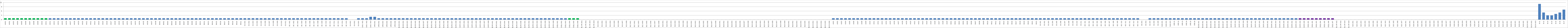
| Category | Series 0 |
|---|---|
| AW01 | 1 |
| AW02 | 1 |
| AW03 | 1 |
| AW04 | 1 |
| AW05 | 1 |
| AW06 | 1 |
| AW07 | 1 |
| AW08 | 1 |
| AW09 | 1 |
| AW10 | 1 |
| AW11 | 1 |
| AW12 | 1 |
| AW13 | 1 |
| AW14 | 1 |
| AW15 | 1 |
| AW16 | 1 |
| AW17 | 1 |
| AW18 | 1 |
| AW19 | 1 |
| AW20 | 1 |
| AW21 | 1 |
| AW22 | 1 |
| AW23 | 1 |
| AW24 | 1 |
| AW25 | 1 |
| AW26 | 1 |
| AW27 | 1 |
| AW28 | 1 |
| AW29 | 1 |
| AW30 | 1 |
| AW31 | 1 |
| AW32 | 1 |
| AW33 | 1 |
| AW34 | 1 |
| AW35 | 1 |
| AW36 | 1 |
| AW37 | 1 |
| AW38 | 1 |
| BW01 | 1 |
| BW02 | 1 |
| BW03 | 1 |
| BWO4 | 1 |
| BW05 | 1 |
| BW06 | 1 |
| BW07 | 1 |
| BW08 | 1 |
| BW09 | 1 |
| BW10 | 1 |
| BW11 | 1 |
| BW12 | 1 |
| BW13 | 1 |
| BW14 | 1 |
| BW15 | 1 |
| BW16 | 1 |
| BW17 | 1 |
| BW18 | 1 |
| BW19 | 1 |
| BW20 | 1 |
| BW21 | 1 |
| OS.W01 | 1 |
| OS.W02 | 1 |
| OS.W03 | 1 |
| OS.W04 | 1 |
| OS.W05 | 1 |
| OS.W06 | 1 |
| OS.W07 | 1 |
| OS.W08 | 1 |
| OS.W09 | 1 |
| OS.W10 | 1 |
| OS.W11 | 1 |
| OE. W01 | 1 |
| OE. W02 | 1 |
| OE. W03 | 1 |
| OE. W04 | 1 |
| OE. W05 | 1 |
| OE. W06 | 1 |
| OE. W07 | 1 |
| OE. W08 | 1 |
| OE. W09 | 1 |
| OE. W10 | 1 |
| OE. W11 | 1 |
| OE. W12 | 1 |
| OE. W13 | 1 |
| OE. W14 | 1 |
| OE. W15 | 1 |
| OA.W01 | 0 |
| OA.W02 | 0 |
| OA.W03 | 1 |
| OAN. W01 | 1 |
| OAN. W02 | 1 |
| OAN. W03 | 2 |
| OPE.W01 | 2 |
| OPE.W02 | 1 |
| OPE.W03 | 1 |
| OPE.W04 | 1 |
| OPE.W05 | 1 |
| OPE.W06 | 1 |
| B1OD.W01 | 1 |
| B1OD.W02 | 1 |
| B1OD.W03 | 1 |
| B1OD.W04 | 1 |
| B1OD.W05 | 1 |
| B1OD.W06 | 1 |
| B1OD.W07 | 1 |
| B1PZ.W01 | 1 |
| B1PZ.W02 | 1 |
| B1PZ.W03 | 1 |
| B1PZ.W04 | 1 |
| B1PZ.W05 | 1 |
| B1PZ.W06 | 1 |
| B1PZ.W07 | 1 |
| B1PZ.W08 | 1 |
| B1PS.W01 | 1 |
| B1PS.W02 | 1 |
| B1PS.W03 | 1 |
| B1PS.W04 | 1 |
| B1PS.W05 | 1 |
| B1PS.W06 | 1 |
| B1PS.W07 | 1 |
| B1PS.W08 | 1 |
| B1MŚ.W01 | 1 |
| B1MŚ.W02 | 1 |
| B1MŚ.W03 | 1 |
| B1MŚ.W04 | 1 |
| B1MŚ.W05 | 1 |
| B1MŚ.W06 | 1 |
| B1MŚ.W07 | 1 |
| B1MŚ.W08 | 1 |
| B1PO.W01 | 1 |
| B1PO.W02 | 1 |
| B1PO.W03 | 1 |
| B1PO.W04 | 1 |
| B1PO.W05 | 1 |
| B1PO.W06 | 1 |
| B1PO.W07 | 1 |
| B1PO.W08 | 1 |
| B1EL.W01 | 1 |
| B1EL.W02 | 1 |
| B1EL.W03 | 1 |
| B1EL.W04 | 1 |
| B1EL.W05 | 1 |
| B1EL.W06 | 1 |
| B1.PR.W01 | 0 |
| B1.PR.W02 | 0 |
| B1.PR.W03 | 0 |
| B1.PR.W04 | 0 |
| B1S.W01 | 0 |
| B1S.W02 | 0 |
| B1S.W03 | 0 |
| B1S.W04 | 0 |
| B1S.W05 | 0 |
| B1S.W06 | 0 |
| B1S.W07 | 0 |
| B1S.W08 | 0 |
| B2C.W01 | 0 |
| B2C.W02 | 0 |
| B2C.W03 | 0 |
| B2C.W04 | 0 |
| B2C.W05 | 0 |
| B2C.W06 | 0 |
| B2C.W07 | 0 |
| B2C.W08 | 0 |
| B2K.W01 | 0 |
| B2K.W02 | 0 |
| B2K.W03 | 0 |
| B2K.W04 | 0 |
| B2K.W05 | 0 |
| B2K.W06 | 0 |
| B2U.W01 | 0 |
| B2U.W02 | 0 |
| B2U.W03 | 0 |
| B2U.W04 | 0 |
| B2U.W05 | 0 |
| B2U.W06 | 0 |
| B2U.W07 | 0 |
| B2U.W08 | 0 |
| B2N.W01 | 0 |
| B2N.W02 | 0 |
| B2N.W03 | 0 |
| B2N.W04 | 0 |
| B2N.W05 | 0 |
| B2N.W06 | 0 |
| B2N.W07 | 0 |
| B2N.W08 | 0 |
| B2O.W01 | 0 |
| B2O.W02 | 0 |
| B2O.W03 | 0 |
| B2O.W04 | 0 |
| B2O.W05 | 0 |
| B2O.W06 | 0 |
| B2O.W07 | 0 |
| B2O.W08 | 0 |
| B2O.W09 | 0 |
| B2D.W01 | 0 |
| B2D.W02 | 0 |
| B2D.W03 | 0 |
| B2D.W04 | 0 |
| B2D.W05 | 0 |
| B2CH.W01 | 0 |
| B2CH.W02 | 0 |
| B2CH.W03 | 0 |
| B2CH.W04 | 0 |
| B2CH.W05 | 0 |
| B2CH.W06 | 0 |
| AU01 | 1 |
| AU02 | 1 |
| AU03 | 1 |
| AU04 | 1 |
| AU05 | 1 |
| AU06 | 1 |
| AU07 | 1 |
| AU08 | 1 |
| AU09 | 1 |
| AU10 | 1 |
| AU11 | 1 |
| AU12 | 1 |
| AU13 | 1 |
| AU14 | 1 |
| AU15 | 1 |
| AU16 | 1 |
| AU17 | 1 |
| AU18 | 1 |
| AU19 | 1 |
| AU20 | 1 |
| AU21 | 1 |
| AU22 | 1 |
| AU23 | 1 |
| AU24 | 1 |
| AU25 | 1 |
| AU26 | 1 |
| AU27 | 1 |
| AU28 | 1 |
| AU29 | 1 |
| BU01 | 1 |
| BU02 | 1 |
| BU03 | 1 |
| BU04 | 1 |
| BU05 | 1 |
| BU06 | 1 |
| BU07 | 1 |
| BU08 | 1 |
| BU09 | 1 |
| BU10 | 1 |
| BU11 | 1 |
| BU12 | 1 |
| BU13 | 1 |
| BU14 | 1 |
| BU15 | 1 |
| BU16 | 1 |
| BU17 | 1 |
| BU18 | 1 |
| BU19 | 1 |
| BU20 | 1 |
| BU21 | 1 |
| BU22 | 1 |
| OS.U01 | 1 |
| OS.U02 | 1 |
| OS.U03 | 1 |
| OS.U04 | 1 |
| OS.U05 | 1 |
| OS.U06 | 1 |
| OS.U07 | 1 |
| OS.U08 | 1 |
| OS.U09 | 1 |
| OS.U10 | 1 |
| OS.U11 | 1 |
| OE. U01 | 1 |
| OE. U02 | 1 |
| OE. U03 | 1 |
| OE. U04 | 1 |
| OE. U05 | 1 |
| OE. U06 | 1 |
| OE. U07 | 1 |
| OE. U08 | 1 |
| OE. U09 | 1 |
| OE. U10 | 1 |
| OE. U11 | 1 |
| OE. U12 | 1 |
| OE. U13 | 1 |
| OE. U14 | 1 |
| OA.U01 | 0 |
| OA.U02 | 0 |
| OA.U03 | 1 |
| OA.U04 | 1 |
| OA.U05 | 1 |
| OAN.U01 | 1 |
| OAN.U02 | 1 |
| OAN.U03 | 1 |
| OPE.01 | 1 |
| OPE.02 | 1 |
| OPE.03 | 1 |
| OPE.04 | 1 |
| OPE.05 | 1 |
| OPE.06 | 1 |
| B1OD.U01 | 1 |
| B1OD.U02 | 1 |
| B1OD.U03 | 1 |
| B1OD.U04 | 1 |
| B1OD.U05 | 1 |
| B1OD.U06 | 1 |
| B1OD.U07 | 1 |
| B1OD.U08 | 1 |
| B1PZ.U01 | 1 |
| B1PZ.U02 | 1 |
| B1PZ.U03 | 1 |
| B1PZ.U04 | 1 |
| B1PZ.U05 | 1 |
| B1PS.U01 | 1 |
| B1PS.U02 | 1 |
| B1PS.U03 | 1 |
| B1PS.U04 | 1 |
| B1MŚ.U01 | 1 |
| B1MŚ.U02 | 1 |
| B1MŚ.U03 | 1 |
| B1MŚ.U04 | 1 |
| B1MŚ.U05 | 1 |
| B1PO.U01 | 1 |
| B1PO.U02 | 1 |
| B1PO.U03 | 1 |
| B1PO.U04 | 1 |
| B1PO.U05 | 1 |
| B1EL.U01 | 1 |
| B1EL.U02 | 1 |
| B1EL.U03 | 1 |
| B1EL.U04 | 1 |
| B1EL.U05 | 1 |
| B1EL.U06 | 1 |
| B1EL.U07 | 1 |
| B1.RP.U01 | 0 |
| B1.RP.U02 | 0 |
| B1.RP.U03 | 0 |
| B1.RP.U04 | 0 |
| B2S.U01 | 0 |
| B2S.U02 | 0 |
| B2S.U03 | 0 |
| B2S.U04 | 0 |
| B2S.U05 | 0 |
| B2S.U06 | 0 |
| B2C.U01 | 0 |
| B2C.U02 | 0 |
| B2C.U03 | 0 |
| B2C.U04 | 0 |
| B2C.U05 | 0 |
| B2C.U06 | 0 |
| B2C.U07 | 0 |
| B2K.U01 | 0 |
| B2K.U02 | 0 |
| B2K.U03 | 0 |
| B2K.U04 | 0 |
| B2U.U01 | 0 |
| B2U.U02 | 0 |
| B2U.U03 | 0 |
| B2U.U04 | 0 |
| B2U.U05 | 0 |
| B2U.U06 | 0 |
| B2U.U07 | 0 |
| B2N.U01 | 0 |
| B2N.U02 | 0 |
| B2N.U03 | 0 |
| B2N.U04 | 0 |
| B2N.U05 | 0 |
| B2N.U06 | 0 |
| B2N.U07 | 0 |
| B2O.U01 | 0 |
| B2O.U02 | 0 |
| B2O.U03 | 0 |
| B2O.U04 | 0 |
| B2O.U05 | 0 |
| B2O.U06 | 0 |
| B2O.U07 | 0 |
| B2D.U01 | 0 |
| B2D.U02 | 0 |
| B2D.U03 | 0 |
| B2D.U04 | 0 |
| B2D.U05 | 0 |
| B2CH.U01 | 0 |
| B2CH.U02 | 0 |
| B2CH.U03 | 0 |
| B.K1 | 11 |
| B.K2 | 5 |
| B.K3 | 3 |
| B.K4 | 3 |
| B.K5 | 4 |
| B.K6 | 5 |
| B.K7 | 7 |